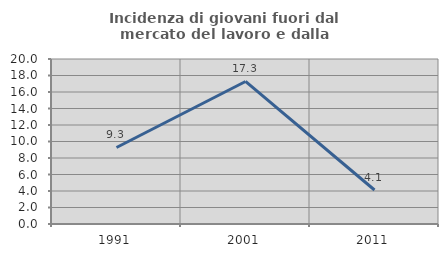
| Category | Incidenza di giovani fuori dal mercato del lavoro e dalla formazione  |
|---|---|
| 1991.0 | 9.274 |
| 2001.0 | 17.277 |
| 2011.0 | 4.124 |